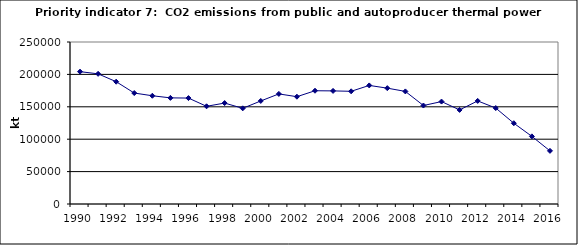
| Category | CO2 emissions from public and autoproducer thermal power stations, kt |
|---|---|
| 1990 | 204254.791 |
| 1991 | 200858.311 |
| 1992 | 188753.65 |
| 1993 | 171226.101 |
| 1994 | 167030.746 |
| 1995 | 163783.274 |
| 1996 | 163460.29 |
| 1997 | 150769.954 |
| 1998 | 155749.503 |
| 1999 | 147653.881 |
| 2000 | 159007.638 |
| 2001 | 169889.865 |
| 2002 | 165587.886 |
| 2003 | 174768.935 |
| 2004 | 174529.975 |
| 2005 | 173913.516 |
| 2006 | 182972.189 |
| 2007 | 178771.956 |
| 2008 | 173741.052 |
| 2009 | 151959.408 |
| 2010 | 158061.841 |
| 2011 | 145206.403 |
| 2012 | 159083.913 |
| 2013 | 148065.721 |
| 2014 | 124683.617 |
| 2015 | 104361.701 |
| 2016 | 82007.974 |